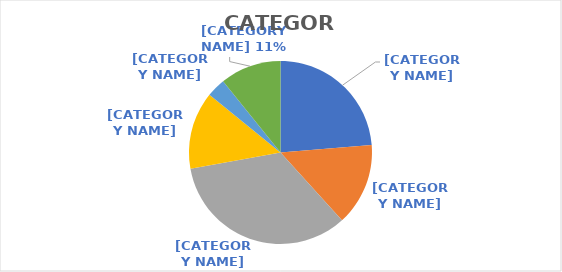
| Category | Series 0 | Series 1 |
|---|---|---|
| Behavioral Health (Adult/Children) | 130285087.49 | 0.237 |
| Child Care | 80044280 | 0.146 |
| Infrastructure | 186241068.68 | 0.339 |
| Public Health | 75142298.98 | 0.137 |
| Social Services | 18451221.7 | 0.034 |
| Workforce | 59336325.28 | 0.108 |